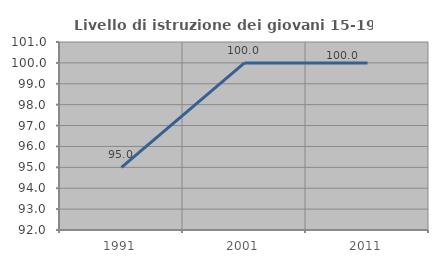
| Category | Livello di istruzione dei giovani 15-19 anni |
|---|---|
| 1991.0 | 95 |
| 2001.0 | 100 |
| 2011.0 | 100 |